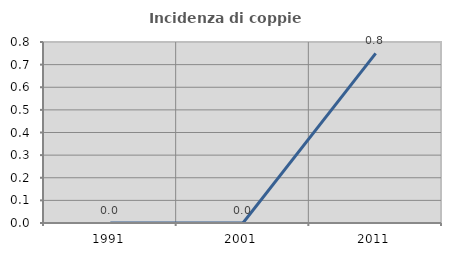
| Category | Incidenza di coppie miste |
|---|---|
| 1991.0 | 0 |
| 2001.0 | 0 |
| 2011.0 | 0.75 |